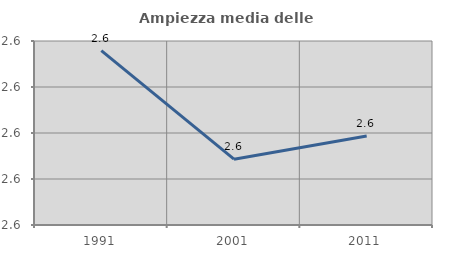
| Category | Ampiezza media delle famiglie |
|---|---|
| 1991.0 | 2.588 |
| 2001.0 | 2.564 |
| 2011.0 | 2.569 |